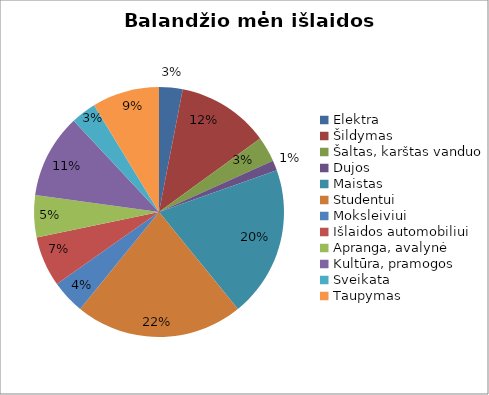
| Category | Balandžio mėn išlaidos |
|---|---|
| Elektra | 28 |
| Šildymas | 110 |
| Šaltas, karštas vanduo | 30 |
| Dujos | 12 |
| Maistas | 180 |
| Studentui | 200 |
| Moksleiviui | 40 |
| Išlaidos automobiliui | 60 |
| Apranga, avalynė | 50 |
| Kultūra, pramogos | 100 |
| Sveikata | 30 |
| Taupymas | 80 |